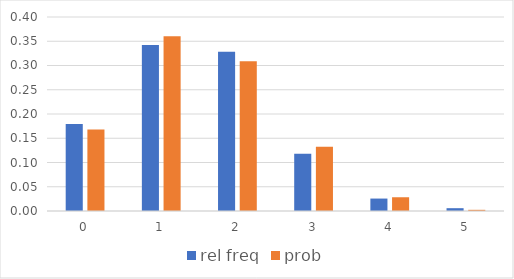
| Category | rel freq | prob |
|---|---|---|
| 0.0 | 0.179 | 0.168 |
| 1.0 | 0.342 | 0.36 |
| 2.0 | 0.328 | 0.309 |
| 3.0 | 0.118 | 0.132 |
| 4.0 | 0.026 | 0.028 |
| 5.0 | 0.006 | 0.002 |